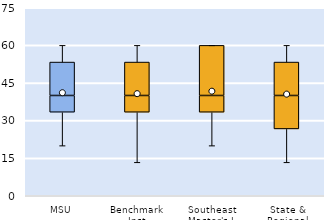
| Category | 25th | 50th | 75th |
|---|---|---|---|
| MSU | 33.333 | 6.667 | 13.333 |
| Benchmark Inst | 33.333 | 6.667 | 13.333 |
| Southeast Master's-L | 33.333 | 6.667 | 20 |
| State & Regional | 26.667 | 13.333 | 13.333 |